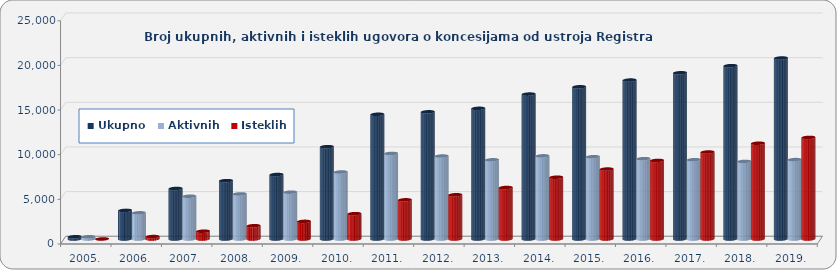
| Category | Ukupno | Aktivnih | Isteklih |
|---|---|---|---|
| 2005. | 252 | 248 | 4 |
| 2006. | 3203 | 2931 | 272 |
| 2007. | 5657 | 4787 | 870 |
| 2008. | 6533 | 5049 | 1484 |
| 2009. | 7218 | 5246 | 1972 |
| 2010. | 10337 | 7502 | 2835 |
| 2011. | 13965 | 9581 | 4384 |
| 2012. | 14241 | 9288 | 4953 |
| 2013. | 14630 | 8867 | 5763 |
| 2014. | 16226 | 9308 | 6918 |
| 2015. | 17043 | 9212 | 7831 |
| 2016. | 17795 | 8996 | 8799 |
| 2017. | 18612 | 8875 | 9737 |
| 2018. | 19407 | 8686 | 10721 |
| 2019. | 20266 | 8889 | 11377 |